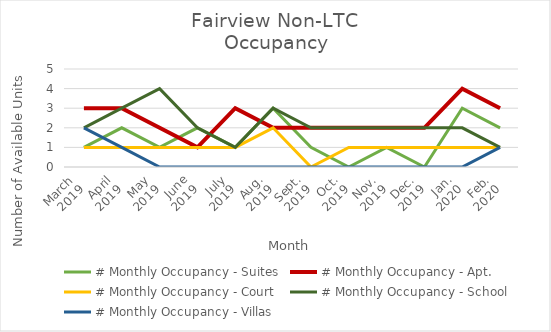
| Category | # Monthly Occupancy - Suites | # Monthly Occupancy - Apt. | # Monthly Occupancy - Court | # Monthly Occupancy - School | # Monthly Occupancy - Villas |
|---|---|---|---|---|---|
| March
2019 | 1 | 3 | 1 | 2 | 2 |
| April
2019 | 2 | 3 | 1 | 3 | 1 |
| May
2019 | 1 | 2 | 1 | 4 | 0 |
| June
2019 | 2 | 1 | 1 | 2 | 0 |
| July
2019 | 1 | 3 | 1 | 1 | 0 |
| Aug.
2019 | 3 | 2 | 2 | 3 | 0 |
| Sept.
2019 | 1 | 2 | 0 | 2 | 0 |
| Oct.
2019 | 0 | 2 | 1 | 2 | 0 |
| Nov.
2019 | 1 | 2 | 1 | 2 | 0 |
| Dec.
2019 | 0 | 2 | 1 | 2 | 0 |
| Jan.
2020 | 3 | 4 | 1 | 2 | 0 |
| Feb.
2020 | 2 | 3 | 1 | 1 | 1 |